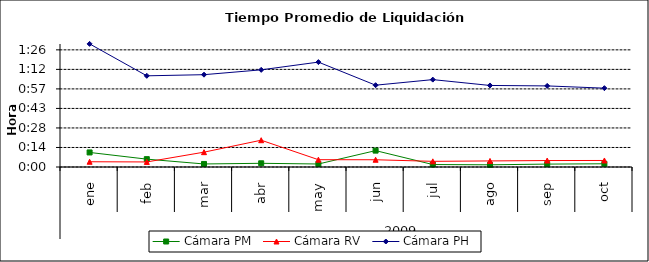
| Category | Cámara PM | Cámara RV | Cámara PH |
|---|---|---|---|
| 0 | 0.007 | 0.003 | 0.063 |
| 1 | 0.004 | 0.003 | 0.047 |
| 2 | 0.002 | 0.008 | 0.047 |
| 3 | 0.002 | 0.014 | 0.05 |
| 4 | 0.002 | 0.004 | 0.054 |
| 5 | 0.008 | 0.004 | 0.042 |
| 6 | 0.001 | 0.003 | 0.045 |
| 7 | 0.001 | 0.003 | 0.042 |
| 8 | 0.001 | 0.003 | 0.042 |
| 9 | 0.002 | 0.003 | 0.04 |